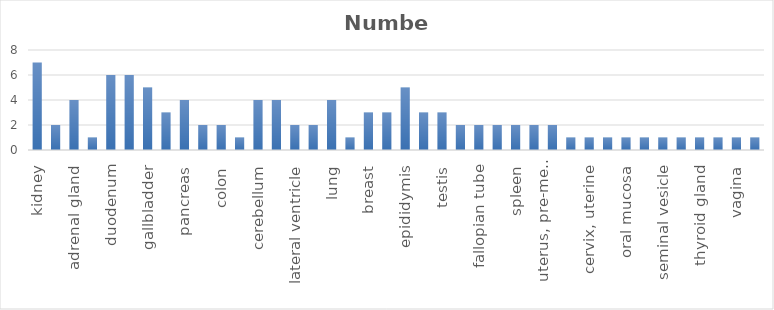
| Category | Number |
|---|---|
| kidney | 7 |
| prostate | 2 |
| adrenal gland | 4 |
| urinary bladder | 1 |
| duodenum | 6 |
| small intestine | 6 |
| gallbladder | 5 |
| stomach, upper | 3 |
| pancreas | 4 |
| liver | 2 |
| colon | 2 |
| rectum | 1 |
| cerebellum | 4 |
| cerebral cortex | 4 |
| lateral ventricle | 2 |
| hippocampus | 2 |
| lung | 4 |
| bronchus | 1 |
| breast | 3 |
| nasopharynx | 3 |
| epididymis | 5 |
| placenta | 3 |
| testis | 3 |
| bone marrow | 2 |
| fallopian tube | 2 |
| skin | 2 |
| spleen | 2 |
| uterus, post-menopause | 2 |
| uterus, pre-menopause | 2 |
| appendix | 1 |
| cervix, uterine | 1 |
| lymph node | 1 |
| oral mucosa | 1 |
| parathyroid gland | 1 |
| seminal vesicle | 1 |
| soft tissue 2 | 1 |
| thyroid gland | 1 |
| tonsil | 1 |
| vagina | 1 |
| vulva/anal skin | 1 |